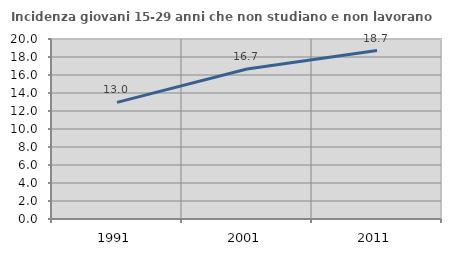
| Category | Incidenza giovani 15-29 anni che non studiano e non lavorano  |
|---|---|
| 1991.0 | 12.956 |
| 2001.0 | 16.667 |
| 2011.0 | 18.712 |